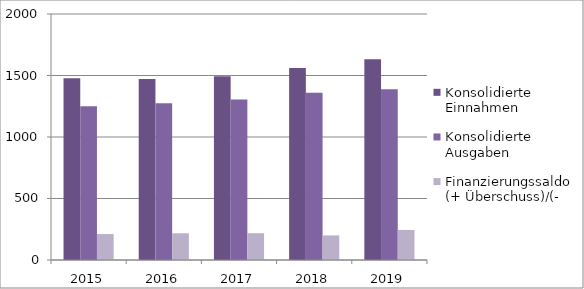
| Category | Konsolidierte Einnahmen | Konsolidierte Ausgaben | Finanzierungssaldo (+ Überschuss)/(- Defizit) |
|---|---|---|---|
| 2015.0 | 1477.6 | 1250.3 | 211.1 |
| 2016.0 | 1471.3 | 1275.2 | 217.4 |
| 2017.0 | 1494 | 1305.3 | 217.8 |
| 2018.0 | 1560 | 1360.2 | 199.7 |
| 2019.0 | 1631.8 | 1387.4 | 244.4 |